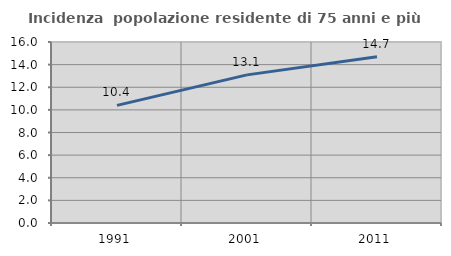
| Category | Incidenza  popolazione residente di 75 anni e più |
|---|---|
| 1991.0 | 10.4 |
| 2001.0 | 13.095 |
| 2011.0 | 14.698 |